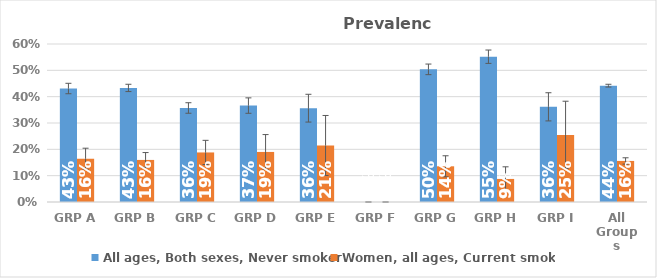
| Category | All ages, Both sexes, Never smoker | Women, all ages, Current smoker |
|---|---|---|
| GRP A | 0.431 | 0.164 |
| GRP B | 0.433 | 0.16 |
| GRP C | 0.357 | 0.188 |
| GRP D | 0.366 | 0.19 |
| GRP E | 0.356 | 0.215 |
| GRP F | 0 | 0 |
| GRP G | 0.504 | 0.136 |
| GRP H | 0.552 | 0.088 |
| GRP I | 0.361 | 0.255 |
| All Groups | 0.442 | 0.156 |